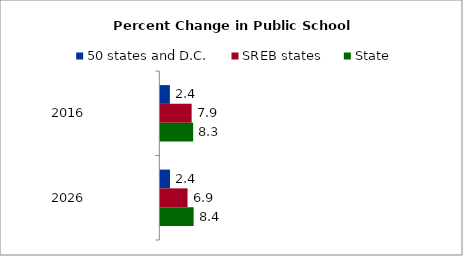
| Category | 50 states and D.C. | SREB states | State |
|---|---|---|---|
| 2016.0 | 2.414 | 7.918 | 8.298 |
| 2026.0 | 2.438 | 6.881 | 8.42 |